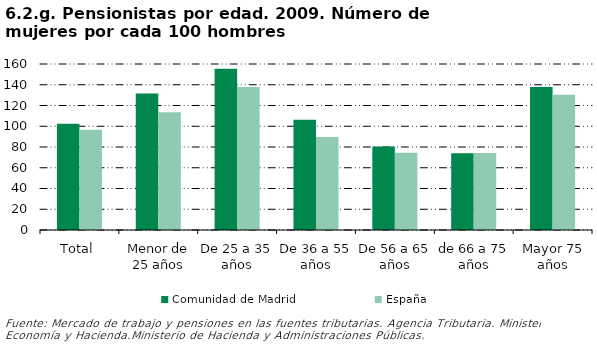
| Category | Comunidad de Madrid | España |
|---|---|---|
| Total | 102.384 | 96.525 |
| Menor de 25 años | 131.565 | 113.515 |
| De 25 a 35 años | 155.46 | 137.757 |
| De 36 a 55 años | 106.207 | 89.636 |
| De 56 a 65 años | 80.509 | 74.347 |
| de 66 a 75 años | 74.02 | 74.166 |
| Mayor 75 años | 137.725 | 130.304 |